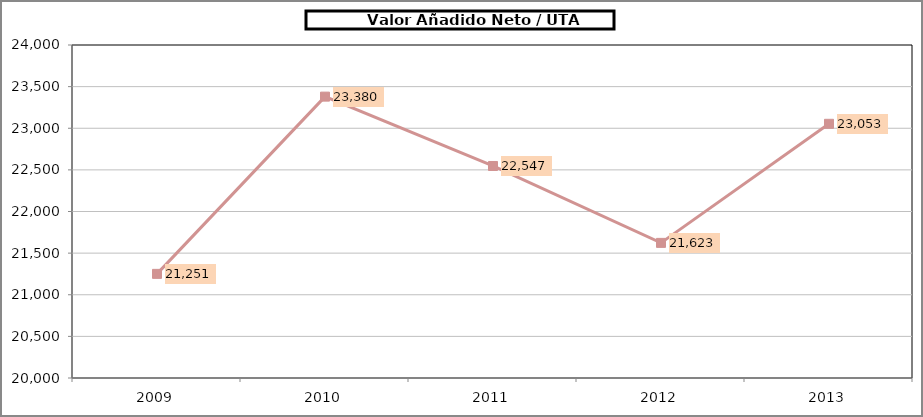
| Category |      Valor Añadido Neto / UTA (euros/UTA) |
|---|---|
| 2009.0 | 21250.865 |
| 2010.0 | 23379.786 |
| 2011.0 | 22546.842 |
| 2012.0 | 21623.058 |
| 2013.0 | 23053.311 |